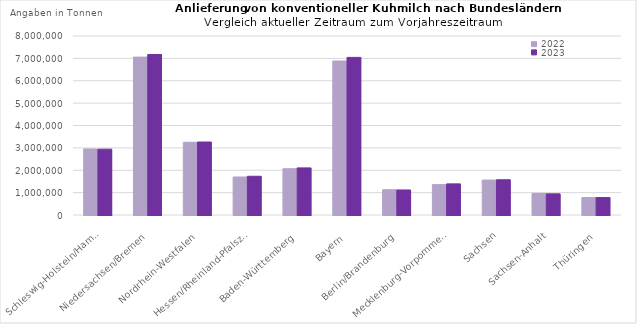
| Category | 2022 | 2023 |
|---|---|---|
| Schleswig-Holstein/Hamburg | 2950663.008 | 2943780.46 |
| Niedersachsen/Bremen | 7056611.521 | 7174128.522 |
| Nordrhein-Westfalen | 3251397.149 | 3261424.275 |
| Hessen/Rheinland-PfalszSaarland | 1698977.3 | 1730473.489 |
| Baden-Württemberg | 2069214.413 | 2104369.504 |
| Bayern | 6883352.386 | 7044128.659 |
| Berlin/Brandenburg | 1130023.023 | 1118067.611 |
| Mecklenburg-Vorpommern | 1358062.759 | 1390828.574 |
| Sachsen | 1560922.289 | 1575370.339 |
| Sachsen-Anhalt | 964004.72 | 946615.37 |
| Thüringen | 780198.965 | 779453.692 |